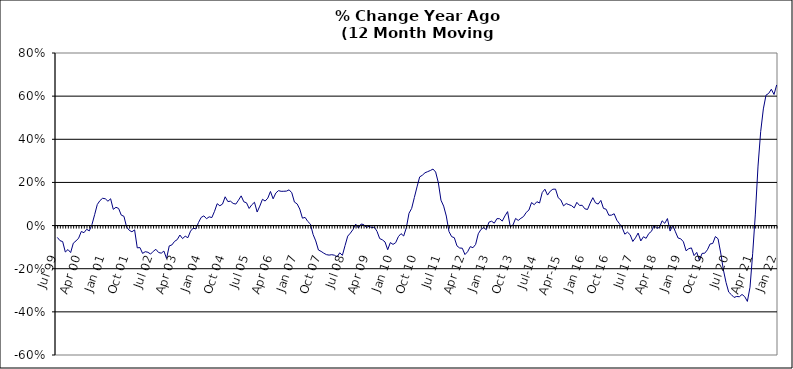
| Category | Series 0 |
|---|---|
| Jul 99 | -0.055 |
| Aug 99 | -0.07 |
| Sep 99 | -0.074 |
| Oct 99 | -0.123 |
| Nov 99 | -0.111 |
| Dec 99 | -0.125 |
| Jan 00 | -0.082 |
| Feb 00 | -0.071 |
| Mar 00 | -0.058 |
| Apr 00 | -0.027 |
| May 00 | -0.033 |
| Jun 00 | -0.017 |
| Jul 00 | -0.025 |
| Aug 00 | 0.005 |
| Sep 00 | 0.05 |
| Oct 00 | 0.098 |
| Nov 00 | 0.116 |
| Dec 00 | 0.127 |
| Jan 01 | 0.124 |
| Feb 01 | 0.113 |
| Mar 01 | 0.124 |
| Apr 01 | 0.075 |
| May 01 | 0.085 |
| Jun 01 | 0.08 |
| Jul 01 | 0.048 |
| Aug 01 | 0.043 |
| Sep 01 | -0.007 |
| Oct 01 | -0.022 |
| Nov 01 | -0.029 |
| Dec 01 | -0.02 |
| Jan 02 | -0.103 |
| Feb 02 | -0.102 |
| Mar 02 | -0.129 |
| Apr 02 | -0.121 |
| May 02 | -0.124 |
| Jun 02 | -0.132 |
| Jul 02 | -0.119 |
| Aug 02 | -0.11 |
| Sep 02 | -0.125 |
| Oct 02 | -0.128 |
| Nov 02 | -0.118 |
| Dec 02 | -0.153 |
| Jan 03 | -0.094 |
| Feb 03 | -0.09 |
| Mar 03 | -0.073 |
| Apr 03 | -0.065 |
| May 03 | -0.044 |
| Jun 03 | -0.06 |
| Jul 03 | -0.049 |
| Aug 03 | -0.056 |
| Sep 03 | -0.026 |
| Oct 03 | -0.012 |
| Nov 03 | -0.016 |
| Dec 03 | 0.014 |
| Jan 04 | 0.038 |
| Feb 04 | 0.045 |
| Mar 04 | 0.032 |
| Apr 04 | 0.041 |
| May 04 | 0.037 |
| Jun 04 | 0.066 |
| Jul 04 | 0.101 |
| Aug 04 | 0.092 |
| Sep 04 | 0.1 |
| Oct 04 | 0.133 |
| Nov 04 | 0.111 |
| Dec 04 | 0.113 |
| Jan 05 | 0.103 |
| Feb 05 | 0.1 |
| Mar 05 | 0.118 |
| Apr 05 | 0.138 |
| May 05 | 0.11 |
| Jun 05 | 0.106 |
| Jul 05 | 0.079 |
| Aug 05 | 0.097 |
| Sep 05 | 0.108 |
| Oct 05 | 0.063 |
| Nov 05 | 0.09 |
| Dec 05 | 0.122 |
| Jan 06 | 0.114 |
| Feb 06 | 0.127 |
| Mar 06 | 0.158 |
| Apr 06 | 0.124 |
| May 06 | 0.151 |
| Jun 06 | 0.162 |
| Jul 06 | 0.159 |
| Aug 06 | 0.159 |
| Sep 06 | 0.16 |
| Oct 06 | 0.166 |
| Nov 06 | 0.152 |
| Dec 06 | 0.109 |
| Jan 07 | 0.101 |
| Feb 07 | 0.076 |
| Mar 07 | 0.034 |
| Apr 07 | 0.038 |
| May 07 | 0.019 |
| Jun 07 | 0.007 |
| Jul 07 | -0.041 |
| Aug 07 | -0.071 |
| Sep 07 | -0.113 |
| Oct 07 | -0.12 |
| Nov 07 | -0.128 |
| Dec 07 | -0.135 |
| Jan 08 | -0.137 |
| Feb 08 | -0.135 |
| Mar 08 | -0.137 |
| Apr 08 | -0.145 |
| May 08 | -0.126 |
| Jun 08 | -0.138 |
| Jul 08 | -0.093 |
| Aug 08 | -0.049 |
| Sep-08 | -0.035 |
| Oct 08 | -0.018 |
| Nov 08 | 0.007 |
| Dec 08 | -0.011 |
| Jan 09 | 0.007 |
| Feb 09 | 0.005 |
| Mar 09 | -0.009 |
| Apr 09 | -0.003 |
| May 09 | -0.01 |
| Jun 09 | -0.007 |
| Jul 09 | -0.027 |
| Aug 09 | -0.06 |
| Sep 09 | -0.066 |
| Oct 09 | -0.076 |
| Nov 09 | -0.112 |
| Dec 09 | -0.079 |
| Jan 10 | -0.087 |
| Feb 10 | -0.079 |
| Mar 10 | -0.052 |
| Apr 10 | -0.037 |
| May 10 | -0.048 |
| Jun 10 | -0.01 |
| Jul 10 | 0.057 |
| Aug 10 | 0.08 |
| Sep 10 | 0.13 |
| Oct 10 | 0.179 |
| Nov 10 | 0.226 |
| Dec 10 | 0.233 |
| Jan 11 | 0.245 |
| Feb 11 | 0.25 |
| Mar 11 | 0.255 |
| Apr 11 | 0.262 |
| May 11 | 0.248 |
| Jun 11 | 0.199 |
| Jul 11 | 0.118 |
| Aug 11 | 0.09 |
| Sep 11 | 0.044 |
| Oct 11 | -0.028 |
| Nov 11 | -0.051 |
| Dec 11 | -0.056 |
| Jan 12 | -0.094 |
| Feb 12 | -0.104 |
| Mar 12 | -0.105 |
| Apr 12 | -0.134 |
| May 12 | -0.121 |
| Jun 12 | -0.098 |
| Jul 12 | -0.103 |
| Aug 12 | -0.087 |
| Sep 12 | -0.038 |
| Oct 12 | -0.018 |
| Nov 12 | -0.009 |
| Dec 12 | -0.019 |
| Jan 13 | 0.016 |
| Feb-13 | 0.02 |
| Mar-13 | 0.011 |
| Apr 13 | 0.032 |
| May 13 | 0.032 |
| Jun-13 | 0.021 |
| Jul 13 | 0.045 |
| Aug 13 | 0.065 |
| Sep 13 | -0.005 |
| Oct 13 | 0.002 |
| Nov 13 | 0.033 |
| Dec 13 | 0.024 |
| Jan 14 | 0.034 |
| Feb-14 | 0.042 |
| Mar 14 | 0.061 |
| Apr 14 | 0.072 |
| May 14 | 0.107 |
| Jun 14 | 0.097 |
| Jul-14 | 0.111 |
| Aug-14 | 0.105 |
| Sep 14 | 0.153 |
| Oct 14 | 0.169 |
| Nov 14 | 0.141 |
| Dec 14 | 0.159 |
| Jan 15 | 0.169 |
| Feb 15 | 0.169 |
| Mar 15 | 0.129 |
| Apr-15 | 0.118 |
| May 15 | 0.091 |
| Jun-15 | 0.102 |
| Jul 15 | 0.097 |
| Aug 15 | 0.092 |
| Sep 15 | 0.082 |
| Oct 15 | 0.108 |
| Nov 15 | 0.093 |
| Dec 15 | 0.094 |
| Jan 16 | 0.078 |
| Feb 16 | 0.075 |
| Mar 16 | 0.104 |
| Apr 16 | 0.129 |
| May 16 | 0.105 |
| Jun 16 | 0.1 |
| Jul 16 | 0.117 |
| Aug 16 | 0.08 |
| Sep 16 | 0.076 |
| Oct 16 | 0.048 |
| Nov 16 | 0.048 |
| Dec 16 | 0.055 |
| Jan 17 | 0.025 |
| Feb 17 | 0.009 |
| Mar 17 | -0.01 |
| Apr 17 | -0.04 |
| May 17 | -0.031 |
| Jun 17 | -0.042 |
| Jul 17 | -0.074 |
| Aug 17 | -0.057 |
| Sep 17 | -0.035 |
| Oct 17 | -0.071 |
| Nov 17 | -0.052 |
| Dec 17 | -0.059 |
| Jan 18 | -0.037 |
| Feb 18 | -0.027 |
| Mar 18 | 0 |
| Apr 18 | -0.012 |
| May 18 | -0.009 |
| Jun 18 | 0.022 |
| Jul 18 | 0.01 |
| Aug 18 | 0.033 |
| Sep 18 | -0.025 |
| Oct 18 | 0.002 |
| Nov 18 | -0.029 |
| Dec 18 | -0.058 |
| Jan 19 | -0.061 |
| Feb 19 | -0.075 |
| Mar 19 | -0.117 |
| Apr 19 | -0.107 |
| May 19 | -0.104 |
| Jun 19 | -0.139 |
| Jul 19 | -0.124 |
| Aug 19 | -0.16 |
| Sep 19 | -0.129 |
| Oct 19 | -0.128 |
| Nov 19 | -0.112 |
| Dec 19 | -0.085 |
| Jan 20 | -0.083 |
| Feb 20 | -0.051 |
| Mar 20 | -0.061 |
| Apr 20 | -0.127 |
| May 20 | -0.206 |
| Jun 20 | -0.264 |
| Jul 20 | -0.308 |
| Aug 20 | -0.32 |
| Sep 20 | -0.333 |
| Oct 20 | -0.329 |
| Nov 20 | -0.33 |
| Dec 20 | -0.319 |
| Jan 21 | -0.329 |
| Feb 21 | -0.352 |
| Mar 21 | -0.286 |
| Apr 21 | -0.129 |
| May 21 | 0.053 |
| Jun 21 | 0.276 |
| Jul 21 | 0.435 |
| Aug 21 | 0.541 |
| Sep 21 | 0.604 |
| Oct 21 | 0.613 |
| Nov 21 | 0.632 |
| Dec 21 | 0.608 |
| Jan 22 | 0.652 |